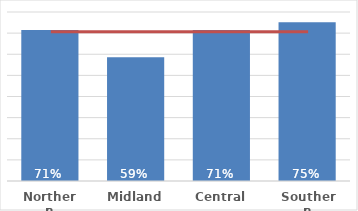
| Category | Pacific |
|---|---|
| Northern | 0.715 |
| Midland | 0.586 |
| Central | 0.714 |
| Southern | 0.751 |